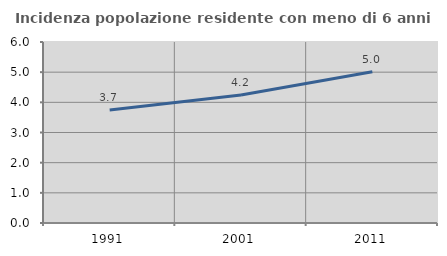
| Category | Incidenza popolazione residente con meno di 6 anni |
|---|---|
| 1991.0 | 3.747 |
| 2001.0 | 4.244 |
| 2011.0 | 5.011 |